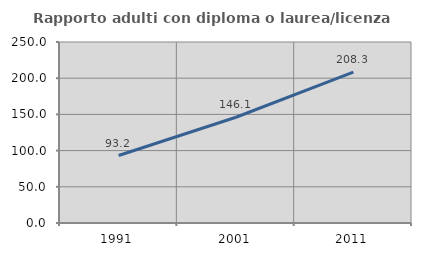
| Category | Rapporto adulti con diploma o laurea/licenza media  |
|---|---|
| 1991.0 | 93.191 |
| 2001.0 | 146.075 |
| 2011.0 | 208.257 |